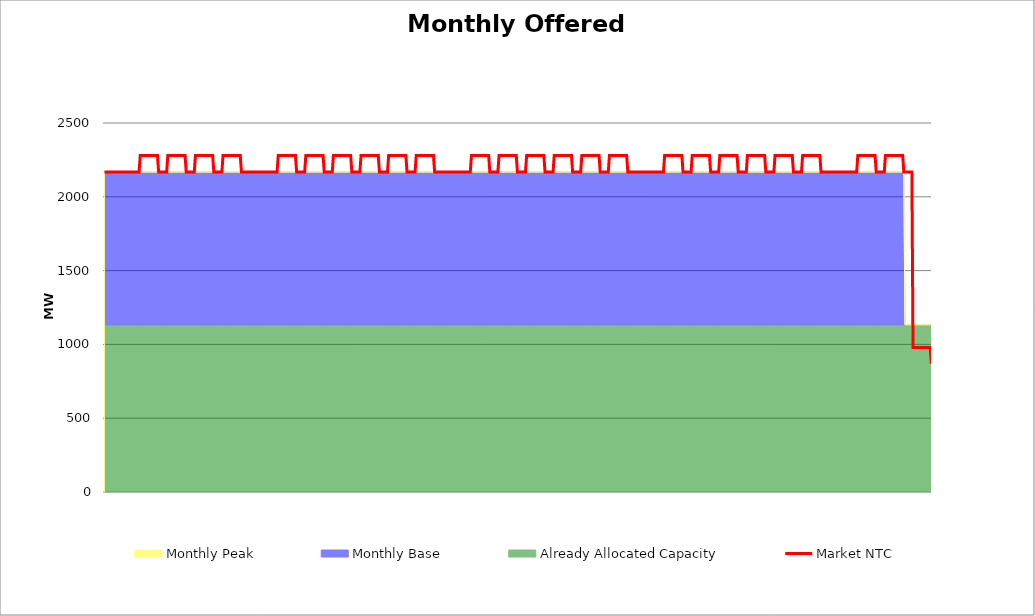
| Category | Market NTC |
|---|---|
| 0 | 2168 |
| 1 | 2168 |
| 2 | 2168 |
| 3 | 2168 |
| 4 | 2168 |
| 5 | 2168 |
| 6 | 2168 |
| 7 | 2168 |
| 8 | 2168 |
| 9 | 2168 |
| 10 | 2168 |
| 11 | 2168 |
| 12 | 2168 |
| 13 | 2168 |
| 14 | 2168 |
| 15 | 2168 |
| 16 | 2168 |
| 17 | 2168 |
| 18 | 2168 |
| 19 | 2168 |
| 20 | 2168 |
| 21 | 2168 |
| 22 | 2168 |
| 23 | 2168 |
| 24 | 2168 |
| 25 | 2168 |
| 26 | 2168 |
| 27 | 2168 |
| 28 | 2168 |
| 29 | 2168 |
| 30 | 2168 |
| 31 | 2279 |
| 32 | 2279 |
| 33 | 2279 |
| 34 | 2279 |
| 35 | 2279 |
| 36 | 2279 |
| 37 | 2279 |
| 38 | 2279 |
| 39 | 2279 |
| 40 | 2279 |
| 41 | 2279 |
| 42 | 2279 |
| 43 | 2279 |
| 44 | 2279 |
| 45 | 2279 |
| 46 | 2279 |
| 47 | 2168 |
| 48 | 2168 |
| 49 | 2168 |
| 50 | 2168 |
| 51 | 2168 |
| 52 | 2168 |
| 53 | 2168 |
| 54 | 2168 |
| 55 | 2279 |
| 56 | 2279 |
| 57 | 2279 |
| 58 | 2279 |
| 59 | 2279 |
| 60 | 2279 |
| 61 | 2279 |
| 62 | 2279 |
| 63 | 2279 |
| 64 | 2279 |
| 65 | 2279 |
| 66 | 2279 |
| 67 | 2279 |
| 68 | 2279 |
| 69 | 2279 |
| 70 | 2279 |
| 71 | 2168 |
| 72 | 2168 |
| 73 | 2168 |
| 74 | 2168 |
| 75 | 2168 |
| 76 | 2168 |
| 77 | 2168 |
| 78 | 2168 |
| 79 | 2279 |
| 80 | 2279 |
| 81 | 2279 |
| 82 | 2279 |
| 83 | 2279 |
| 84 | 2279 |
| 85 | 2279 |
| 86 | 2279 |
| 87 | 2279 |
| 88 | 2279 |
| 89 | 2279 |
| 90 | 2279 |
| 91 | 2279 |
| 92 | 2279 |
| 93 | 2279 |
| 94 | 2279 |
| 95 | 2168 |
| 96 | 2168 |
| 97 | 2168 |
| 98 | 2168 |
| 99 | 2168 |
| 100 | 2168 |
| 101 | 2168 |
| 102 | 2168 |
| 103 | 2279 |
| 104 | 2279 |
| 105 | 2279 |
| 106 | 2279 |
| 107 | 2279 |
| 108 | 2279 |
| 109 | 2279 |
| 110 | 2279 |
| 111 | 2279 |
| 112 | 2279 |
| 113 | 2279 |
| 114 | 2279 |
| 115 | 2279 |
| 116 | 2279 |
| 117 | 2279 |
| 118 | 2279 |
| 119 | 2168 |
| 120 | 2168 |
| 121 | 2168 |
| 122 | 2168 |
| 123 | 2168 |
| 124 | 2168 |
| 125 | 2168 |
| 126 | 2168 |
| 127 | 2168 |
| 128 | 2168 |
| 129 | 2168 |
| 130 | 2168 |
| 131 | 2168 |
| 132 | 2168 |
| 133 | 2168 |
| 134 | 2168 |
| 135 | 2168 |
| 136 | 2168 |
| 137 | 2168 |
| 138 | 2168 |
| 139 | 2168 |
| 140 | 2168 |
| 141 | 2168 |
| 142 | 2168 |
| 143 | 2168 |
| 144 | 2168 |
| 145 | 2168 |
| 146 | 2168 |
| 147 | 2168 |
| 148 | 2168 |
| 149 | 2168 |
| 150 | 2168 |
| 151 | 2279 |
| 152 | 2279 |
| 153 | 2279 |
| 154 | 2279 |
| 155 | 2279 |
| 156 | 2279 |
| 157 | 2279 |
| 158 | 2279 |
| 159 | 2279 |
| 160 | 2279 |
| 161 | 2279 |
| 162 | 2279 |
| 163 | 2279 |
| 164 | 2279 |
| 165 | 2279 |
| 166 | 2279 |
| 167 | 2168 |
| 168 | 2168 |
| 169 | 2168 |
| 170 | 2168 |
| 171 | 2168 |
| 172 | 2168 |
| 173 | 2168 |
| 174 | 2168 |
| 175 | 2279 |
| 176 | 2279 |
| 177 | 2279 |
| 178 | 2279 |
| 179 | 2279 |
| 180 | 2279 |
| 181 | 2279 |
| 182 | 2279 |
| 183 | 2279 |
| 184 | 2279 |
| 185 | 2279 |
| 186 | 2279 |
| 187 | 2279 |
| 188 | 2279 |
| 189 | 2279 |
| 190 | 2279 |
| 191 | 2168 |
| 192 | 2168 |
| 193 | 2168 |
| 194 | 2168 |
| 195 | 2168 |
| 196 | 2168 |
| 197 | 2168 |
| 198 | 2168 |
| 199 | 2279 |
| 200 | 2279 |
| 201 | 2279 |
| 202 | 2279 |
| 203 | 2279 |
| 204 | 2279 |
| 205 | 2279 |
| 206 | 2279 |
| 207 | 2279 |
| 208 | 2279 |
| 209 | 2279 |
| 210 | 2279 |
| 211 | 2279 |
| 212 | 2279 |
| 213 | 2279 |
| 214 | 2279 |
| 215 | 2168 |
| 216 | 2168 |
| 217 | 2168 |
| 218 | 2168 |
| 219 | 2168 |
| 220 | 2168 |
| 221 | 2168 |
| 222 | 2168 |
| 223 | 2279 |
| 224 | 2279 |
| 225 | 2279 |
| 226 | 2279 |
| 227 | 2279 |
| 228 | 2279 |
| 229 | 2279 |
| 230 | 2279 |
| 231 | 2279 |
| 232 | 2279 |
| 233 | 2279 |
| 234 | 2279 |
| 235 | 2279 |
| 236 | 2279 |
| 237 | 2279 |
| 238 | 2279 |
| 239 | 2168 |
| 240 | 2168 |
| 241 | 2168 |
| 242 | 2168 |
| 243 | 2168 |
| 244 | 2168 |
| 245 | 2168 |
| 246 | 2168 |
| 247 | 2279 |
| 248 | 2279 |
| 249 | 2279 |
| 250 | 2279 |
| 251 | 2279 |
| 252 | 2279 |
| 253 | 2279 |
| 254 | 2279 |
| 255 | 2279 |
| 256 | 2279 |
| 257 | 2279 |
| 258 | 2279 |
| 259 | 2279 |
| 260 | 2279 |
| 261 | 2279 |
| 262 | 2279 |
| 263 | 2168 |
| 264 | 2168 |
| 265 | 2168 |
| 266 | 2168 |
| 267 | 2168 |
| 268 | 2168 |
| 269 | 2168 |
| 270 | 2168 |
| 271 | 2279 |
| 272 | 2279 |
| 273 | 2279 |
| 274 | 2279 |
| 275 | 2279 |
| 276 | 2279 |
| 277 | 2279 |
| 278 | 2279 |
| 279 | 2279 |
| 280 | 2279 |
| 281 | 2279 |
| 282 | 2279 |
| 283 | 2279 |
| 284 | 2279 |
| 285 | 2279 |
| 286 | 2279 |
| 287 | 2168 |
| 288 | 2168 |
| 289 | 2168 |
| 290 | 2168 |
| 291 | 2168 |
| 292 | 2168 |
| 293 | 2168 |
| 294 | 2168 |
| 295 | 2168 |
| 296 | 2168 |
| 297 | 2168 |
| 298 | 2168 |
| 299 | 2168 |
| 300 | 2168 |
| 301 | 2168 |
| 302 | 2168 |
| 303 | 2168 |
| 304 | 2168 |
| 305 | 2168 |
| 306 | 2168 |
| 307 | 2168 |
| 308 | 2168 |
| 309 | 2168 |
| 310 | 2168 |
| 311 | 2168 |
| 312 | 2168 |
| 313 | 2168 |
| 314 | 2168 |
| 315 | 2168 |
| 316 | 2168 |
| 317 | 2168 |
| 318 | 2168 |
| 319 | 2279 |
| 320 | 2279 |
| 321 | 2279 |
| 322 | 2279 |
| 323 | 2279 |
| 324 | 2279 |
| 325 | 2279 |
| 326 | 2279 |
| 327 | 2279 |
| 328 | 2279 |
| 329 | 2279 |
| 330 | 2279 |
| 331 | 2279 |
| 332 | 2279 |
| 333 | 2279 |
| 334 | 2279 |
| 335 | 2168 |
| 336 | 2168 |
| 337 | 2168 |
| 338 | 2168 |
| 339 | 2168 |
| 340 | 2168 |
| 341 | 2168 |
| 342 | 2168 |
| 343 | 2279 |
| 344 | 2279 |
| 345 | 2279 |
| 346 | 2279 |
| 347 | 2279 |
| 348 | 2279 |
| 349 | 2279 |
| 350 | 2279 |
| 351 | 2279 |
| 352 | 2279 |
| 353 | 2279 |
| 354 | 2279 |
| 355 | 2279 |
| 356 | 2279 |
| 357 | 2279 |
| 358 | 2279 |
| 359 | 2168 |
| 360 | 2168 |
| 361 | 2168 |
| 362 | 2168 |
| 363 | 2168 |
| 364 | 2168 |
| 365 | 2168 |
| 366 | 2168 |
| 367 | 2279 |
| 368 | 2279 |
| 369 | 2279 |
| 370 | 2279 |
| 371 | 2279 |
| 372 | 2279 |
| 373 | 2279 |
| 374 | 2279 |
| 375 | 2279 |
| 376 | 2279 |
| 377 | 2279 |
| 378 | 2279 |
| 379 | 2279 |
| 380 | 2279 |
| 381 | 2279 |
| 382 | 2279 |
| 383 | 2168 |
| 384 | 2168 |
| 385 | 2168 |
| 386 | 2168 |
| 387 | 2168 |
| 388 | 2168 |
| 389 | 2168 |
| 390 | 2168 |
| 391 | 2279 |
| 392 | 2279 |
| 393 | 2279 |
| 394 | 2279 |
| 395 | 2279 |
| 396 | 2279 |
| 397 | 2279 |
| 398 | 2279 |
| 399 | 2279 |
| 400 | 2279 |
| 401 | 2279 |
| 402 | 2279 |
| 403 | 2279 |
| 404 | 2279 |
| 405 | 2279 |
| 406 | 2279 |
| 407 | 2168 |
| 408 | 2168 |
| 409 | 2168 |
| 410 | 2168 |
| 411 | 2168 |
| 412 | 2168 |
| 413 | 2168 |
| 414 | 2168 |
| 415 | 2279 |
| 416 | 2279 |
| 417 | 2279 |
| 418 | 2279 |
| 419 | 2279 |
| 420 | 2279 |
| 421 | 2279 |
| 422 | 2279 |
| 423 | 2279 |
| 424 | 2279 |
| 425 | 2279 |
| 426 | 2279 |
| 427 | 2279 |
| 428 | 2279 |
| 429 | 2279 |
| 430 | 2279 |
| 431 | 2168 |
| 432 | 2168 |
| 433 | 2168 |
| 434 | 2168 |
| 435 | 2168 |
| 436 | 2168 |
| 437 | 2168 |
| 438 | 2168 |
| 439 | 2279 |
| 440 | 2279 |
| 441 | 2279 |
| 442 | 2279 |
| 443 | 2279 |
| 444 | 2279 |
| 445 | 2279 |
| 446 | 2279 |
| 447 | 2279 |
| 448 | 2279 |
| 449 | 2279 |
| 450 | 2279 |
| 451 | 2279 |
| 452 | 2279 |
| 453 | 2279 |
| 454 | 2279 |
| 455 | 2168 |
| 456 | 2168 |
| 457 | 2168 |
| 458 | 2168 |
| 459 | 2168 |
| 460 | 2168 |
| 461 | 2168 |
| 462 | 2168 |
| 463 | 2168 |
| 464 | 2168 |
| 465 | 2168 |
| 466 | 2168 |
| 467 | 2168 |
| 468 | 2168 |
| 469 | 2168 |
| 470 | 2168 |
| 471 | 2168 |
| 472 | 2168 |
| 473 | 2168 |
| 474 | 2168 |
| 475 | 2168 |
| 476 | 2168 |
| 477 | 2168 |
| 478 | 2168 |
| 479 | 2168 |
| 480 | 2168 |
| 481 | 2168 |
| 482 | 2168 |
| 483 | 2168 |
| 484 | 2168 |
| 485 | 2168 |
| 486 | 2168 |
| 487 | 2279 |
| 488 | 2279 |
| 489 | 2279 |
| 490 | 2279 |
| 491 | 2279 |
| 492 | 2279 |
| 493 | 2279 |
| 494 | 2279 |
| 495 | 2279 |
| 496 | 2279 |
| 497 | 2279 |
| 498 | 2279 |
| 499 | 2279 |
| 500 | 2279 |
| 501 | 2279 |
| 502 | 2279 |
| 503 | 2168 |
| 504 | 2168 |
| 505 | 2168 |
| 506 | 2168 |
| 507 | 2168 |
| 508 | 2168 |
| 509 | 2168 |
| 510 | 2168 |
| 511 | 2279 |
| 512 | 2279 |
| 513 | 2279 |
| 514 | 2279 |
| 515 | 2279 |
| 516 | 2279 |
| 517 | 2279 |
| 518 | 2279 |
| 519 | 2279 |
| 520 | 2279 |
| 521 | 2279 |
| 522 | 2279 |
| 523 | 2279 |
| 524 | 2279 |
| 525 | 2279 |
| 526 | 2279 |
| 527 | 2168 |
| 528 | 2168 |
| 529 | 2168 |
| 530 | 2168 |
| 531 | 2168 |
| 532 | 2168 |
| 533 | 2168 |
| 534 | 2168 |
| 535 | 2279 |
| 536 | 2279 |
| 537 | 2279 |
| 538 | 2279 |
| 539 | 2279 |
| 540 | 2279 |
| 541 | 2279 |
| 542 | 2279 |
| 543 | 2279 |
| 544 | 2279 |
| 545 | 2279 |
| 546 | 2279 |
| 547 | 2279 |
| 548 | 2279 |
| 549 | 2279 |
| 550 | 2279 |
| 551 | 2168 |
| 552 | 2168 |
| 553 | 2168 |
| 554 | 2168 |
| 555 | 2168 |
| 556 | 2168 |
| 557 | 2168 |
| 558 | 2168 |
| 559 | 2279 |
| 560 | 2279 |
| 561 | 2279 |
| 562 | 2279 |
| 563 | 2279 |
| 564 | 2279 |
| 565 | 2279 |
| 566 | 2279 |
| 567 | 2279 |
| 568 | 2279 |
| 569 | 2279 |
| 570 | 2279 |
| 571 | 2279 |
| 572 | 2279 |
| 573 | 2279 |
| 574 | 2279 |
| 575 | 2168 |
| 576 | 2168 |
| 577 | 2168 |
| 578 | 2168 |
| 579 | 2168 |
| 580 | 2168 |
| 581 | 2168 |
| 582 | 2168 |
| 583 | 2279 |
| 584 | 2279 |
| 585 | 2279 |
| 586 | 2279 |
| 587 | 2279 |
| 588 | 2279 |
| 589 | 2279 |
| 590 | 2279 |
| 591 | 2279 |
| 592 | 2279 |
| 593 | 2279 |
| 594 | 2279 |
| 595 | 2279 |
| 596 | 2279 |
| 597 | 2279 |
| 598 | 2279 |
| 599 | 2168 |
| 600 | 2168 |
| 601 | 2168 |
| 602 | 2168 |
| 603 | 2168 |
| 604 | 2168 |
| 605 | 2168 |
| 606 | 2168 |
| 607 | 2279 |
| 608 | 2279 |
| 609 | 2279 |
| 610 | 2279 |
| 611 | 2279 |
| 612 | 2279 |
| 613 | 2279 |
| 614 | 2279 |
| 615 | 2279 |
| 616 | 2279 |
| 617 | 2279 |
| 618 | 2279 |
| 619 | 2279 |
| 620 | 2279 |
| 621 | 2279 |
| 622 | 2279 |
| 623 | 2168 |
| 624 | 2168 |
| 625 | 2168 |
| 626 | 2168 |
| 627 | 2168 |
| 628 | 2168 |
| 629 | 2168 |
| 630 | 2168 |
| 631 | 2168 |
| 632 | 2168 |
| 633 | 2168 |
| 634 | 2168 |
| 635 | 2168 |
| 636 | 2168 |
| 637 | 2168 |
| 638 | 2168 |
| 639 | 2168 |
| 640 | 2168 |
| 641 | 2168 |
| 642 | 2168 |
| 643 | 2168 |
| 644 | 2168 |
| 645 | 2168 |
| 646 | 2168 |
| 647 | 2168 |
| 648 | 2168 |
| 649 | 2168 |
| 650 | 2168 |
| 651 | 2168 |
| 652 | 2168 |
| 653 | 2168 |
| 654 | 2168 |
| 655 | 2279 |
| 656 | 2279 |
| 657 | 2279 |
| 658 | 2279 |
| 659 | 2279 |
| 660 | 2279 |
| 661 | 2279 |
| 662 | 2279 |
| 663 | 2279 |
| 664 | 2279 |
| 665 | 2279 |
| 666 | 2279 |
| 667 | 2279 |
| 668 | 2279 |
| 669 | 2279 |
| 670 | 2279 |
| 671 | 2168 |
| 672 | 2168 |
| 673 | 2168 |
| 674 | 2168 |
| 675 | 2168 |
| 676 | 2168 |
| 677 | 2168 |
| 678 | 2168 |
| 679 | 2279 |
| 680 | 2279 |
| 681 | 2279 |
| 682 | 2279 |
| 683 | 2279 |
| 684 | 2279 |
| 685 | 2279 |
| 686 | 2279 |
| 687 | 2279 |
| 688 | 2279 |
| 689 | 2279 |
| 690 | 2279 |
| 691 | 2279 |
| 692 | 2279 |
| 693 | 2279 |
| 694 | 2279 |
| 695 | 2168 |
| 696 | 2168 |
| 697 | 2168 |
| 698 | 2168 |
| 699 | 2168 |
| 700 | 2168 |
| 701 | 2168 |
| 702 | 2168 |
| 703 | 979 |
| 704 | 979 |
| 705 | 979 |
| 706 | 979 |
| 707 | 979 |
| 708 | 979 |
| 709 | 979 |
| 710 | 979 |
| 711 | 979 |
| 712 | 979 |
| 713 | 979 |
| 714 | 979 |
| 715 | 979 |
| 716 | 979 |
| 717 | 979 |
| 718 | 979 |
| 719 | 868 |